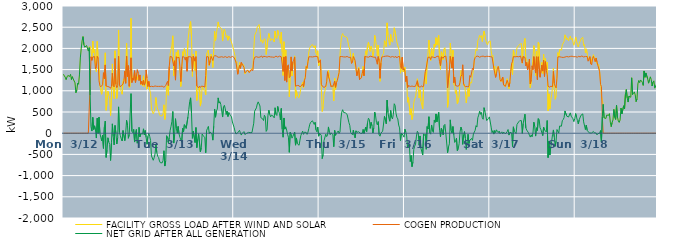
| Category | FACILITY GROSS LOAD AFTER WIND AND SOLAR | COGEN PRODUCTION | NET GRID AFTER ALL GENERATION |
|---|---|---|---|
|  Mon  3/12 | 1390 | 0 | 1390 |
|  Mon  3/12 | 1352 | 0 | 1352 |
|  Mon  3/12 | 1321 | 0 | 1321 |
|  Mon  3/12 | 1262 | 0 | 1262 |
|  Mon  3/12 | 1327 | 0 | 1327 |
|  Mon  3/12 | 1362 | 0 | 1362 |
|  Mon  3/12 | 1377 | 0 | 1377 |
|  Mon  3/12 | 1338 | 0 | 1338 |
|  Mon  3/12 | 1388 | 0 | 1388 |
|  Mon  3/12 | 1266 | 0 | 1266 |
|  Mon  3/12 | 1333 | 0 | 1333 |
|  Mon  3/12 | 1278 | 0 | 1278 |
|  Mon  3/12 | 1258 | 0 | 1258 |
|  Mon  3/12 | 1187 | 0 | 1187 |
|  Mon  3/12 | 955 | 0 | 955 |
|  Mon  3/12 | 1017 | 0 | 1017 |
|  Mon  3/12 | 1180 | 0 | 1180 |
|  Mon  3/12 | 1154 | 0 | 1154 |
|  Mon  3/12 | 1374 | 0 | 1374 |
|  Mon  3/12 | 1775 | 0 | 1775 |
|  Mon  3/12 | 1998 | 0 | 1998 |
|  Mon  3/12 | 2176 | 0 | 2176 |
|  Mon  3/12 | 2278 | 0 | 2278 |
|  Mon  3/12 | 2085 | 0 | 2085 |
|  Mon  3/12 | 2029 | 0 | 2029 |
|  Mon  3/12 | 2047 | 0 | 2047 |
|  Mon  3/12 | 2068 | 0 | 2068 |
|  Mon  3/12 | 2064 | 0 | 2064 |
|  Mon  3/12 | 1937 | 0 | 1937 |
|  Mon  3/12 | 2019 | 0 | 2019 |
|  Mon  3/12 | 2051 | 1151 | 900 |
|  Mon  3/12 | 1959 | 1802 | 157 |
|  Mon  3/12 | 1770 | 1719 | 51 |
|  Mon  3/12 | 2172 | 1799 | 373 |
|  Mon  3/12 | 1894 | 1807 | 87 |
|  Mon  3/12 | 1981 | 1807 | 174 |
|  Mon  3/12 | 1597 | 1518 | 79 |
|  Mon  3/12 | 1450 | 1564 | -114 |
|  Mon  3/12 | 2165 | 1811 | 354 |
|  Mon  3/12 | 1759 | 1765 | -6 |
|  Mon  3/12 | 1614 | 1236 | 378 |
|  Mon  3/12 | 1122 | 1122 | 0 |
|  Mon  3/12 | 998 | 1094 | -96 |
|  Mon  3/12 | 918 | 1098 | -180 |
|  Mon  3/12 | 1092 | 1142 | -50 |
|  Mon  3/12 | 1069 | 1427 | -358 |
|  Mon  3/12 | 1430 | 1286 | 144 |
|  Mon  3/12 | 1896 | 1610 | 286 |
|  Mon  3/12 | 540 | 1111 | -571 |
|  Mon  3/12 | 721 | 1122 | -401 |
|  Mon  3/12 | 993 | 1101 | -108 |
|  Mon  3/12 | 899 | 1108 | -209 |
|  Mon  3/12 | 823 | 1086 | -263 |
|  Mon  3/12 | 416 | 1059 | -643 |
|  Mon  3/12 | 875 | 1102 | -227 |
|  Mon  3/12 | 1634 | 1413 | 221 |
|  Mon  3/12 | 1037 | 1118 | -81 |
|  Mon  3/12 | 815 | 1091 | -276 |
|  Mon  3/12 | 1945 | 1762 | 183 |
|  Mon  3/12 | 1157 | 1157 | 0 |
|  Mon  3/12 | 819 | 1074 | -255 |
|  Mon  3/12 | 1016 | 1119 | -103 |
|  Mon  3/12 | 2435 | 1814 | 621 |
|  Mon  3/12 | 1154 | 1138 | 16 |
|  Mon  3/12 | 1034 | 1090 | -56 |
|  Mon  3/12 | 988 | 1121 | -133 |
|  Mon  3/12 | 919 | 1102 | -183 |
|  Mon  3/12 | 1219 | 1156 | 63 |
|  Mon  3/12 | 1285 | 1237 | 48 |
|  Mon  3/12 | 1289 | 1462 | -173 |
|  Mon  3/12 | 1184 | 1177 | 7 |
|  Mon  3/12 | 2121 | 1817 | 304 |
|  Mon  3/12 | 1526 | 1336 | 190 |
|  Mon  3/12 | 1474 | 1594 | -120 |
|  Mon  3/12 | 1073 | 1106 | -33 |
|  Mon  3/12 | 1105 | 1116 | -11 |
|  Mon  3/12 | 2711 | 1778 | 933 |
|  Mon  3/12 | 1240 | 1194 | 46 |
|  Mon  3/12 | 1313 | 1302 | 11 |
|  Mon  3/12 | 1339 | 1249 | 90 |
|  Mon  3/12 | 1265 | 1474 | -209 |
|  Mon  3/12 | 1213 | 1196 | 17 |
|  Mon  3/12 | 1414 | 1325 | 89 |
|  Mon  3/12 | 1264 | 1499 | -235 |
|  Mon  3/12 | 1252 | 1422 | -170 |
|  Mon  3/12 | 1377 | 1239 | 138 |
|  Mon  3/12 | 1286 | 1374 | -88 |
|  Mon  3/12 | 1146 | 1157 | -11 |
|  Mon  3/12 | 1206 | 1227 | -21 |
|  Mon  3/12 | 1118 | 1139 | -21 |
|  Mon  3/12 | 1353 | 1250 | 103 |
|  Mon  3/12 | 1093 | 1134 | -41 |
|  Mon  3/12 | 1242 | 1179 | 63 |
|  Mon  3/12 | 1392 | 1493 | -101 |
|  Mon  3/12 | 1039 | 1300 | -261 |
|  Mon  3/12 | 1029 | 1101 | -72 |
|  Tue  3/13 | 1218 | 1220 | -2 |
|  Tue  3/13 | 1020 | 1095 | -75 |
|  Tue  3/13 | 935 | 1109 | -174 |
|  Tue  3/13 | 572 | 1107 | -535 |
|  Tue  3/13 | 584 | 1100 | -516 |
|  Tue  3/13 | 458 | 1097 | -639 |
|  Tue  3/13 | 509 | 1089 | -580 |
|  Tue  3/13 | 624 | 1114 | -490 |
|  Tue  3/13 | 842 | 1104 | -262 |
|  Tue  3/13 | 646 | 1104 | -458 |
|  Tue  3/13 | 569 | 1114 | -545 |
|  Tue  3/13 | 531 | 1104 | -573 |
|  Tue  3/13 | 439 | 1095 | -656 |
|  Tue  3/13 | 408 | 1104 | -696 |
|  Tue  3/13 | 414 | 1111 | -697 |
|  Tue  3/13 | 410 | 1110 | -700 |
|  Tue  3/13 | 459 | 1104 | -645 |
|  Tue  3/13 | 670 | 1084 | -414 |
|  Tue  3/13 | 325 | 1100 | -775 |
|  Tue  3/13 | 471 | 1121 | -650 |
|  Tue  3/13 | 1087 | 1144 | -57 |
|  Tue  3/13 | 1134 | 1223 | -89 |
|  Tue  3/13 | 896 | 1123 | -227 |
|  Tue  3/13 | 1471 | 1572 | -101 |
|  Tue  3/13 | 1876 | 1811 | 65 |
|  Tue  3/13 | 1976 | 1812 | 164 |
|  Tue  3/13 | 2076 | 1798 | 278 |
|  Tue  3/13 | 2297 | 1785 | 512 |
|  Tue  3/13 | 1352 | 1585 | -233 |
|  Tue  3/13 | 1663 | 1708 | -45 |
|  Tue  3/13 | 1594 | 1252 | 342 |
|  Tue  3/13 | 1911 | 1803 | 108 |
|  Tue  3/13 | 1774 | 1775 | -1 |
|  Tue  3/13 | 1955 | 1796 | 159 |
|  Tue  3/13 | 1774 | 1790 | -16 |
|  Tue  3/13 | 1467 | 1565 | -98 |
|  Tue  3/13 | 1101 | 1220 | -119 |
|  Tue  3/13 | 1351 | 1562 | -211 |
|  Tue  3/13 | 1922 | 1809 | 113 |
|  Tue  3/13 | 1826 | 1799 | 27 |
|  Tue  3/13 | 1993 | 1790 | 203 |
|  Tue  3/13 | 1902 | 1725 | 177 |
|  Tue  3/13 | 1907 | 1795 | 112 |
|  Tue  3/13 | 1566 | 1461 | 105 |
|  Tue  3/13 | 2183 | 1801 | 382 |
|  Tue  3/13 | 2366 | 1805 | 561 |
|  Tue  3/13 | 2551 | 1804 | 747 |
|  Tue  3/13 | 2633 | 1799 | 834 |
|  Tue  3/13 | 2267 | 1793 | 474 |
|  Tue  3/13 | 1339 | 1461 | -122 |
|  Tue  3/13 | 1866 | 1818 | 48 |
|  Tue  3/13 | 1843 | 1796 | 47 |
|  Tue  3/13 | 1479 | 1699 | -220 |
|  Tue  3/13 | 1940 | 1806 | 134 |
|  Tue  3/13 | 772 | 1114 | -342 |
|  Tue  3/13 | 969 | 1111 | -142 |
|  Tue  3/13 | 1054 | 1068 | -14 |
|  Tue  3/13 | 1106 | 1110 | -4 |
|  Tue  3/13 | 639 | 1080 | -441 |
|  Tue  3/13 | 767 | 1109 | -342 |
|  Tue  3/13 | 1097 | 1116 | -19 |
|  Tue  3/13 | 1048 | 1106 | -58 |
|  Tue  3/13 | 1013 | 1087 | -74 |
|  Tue  3/13 | 989 | 1088 | -99 |
|  Tue  3/13 | 901 | 1362 | -461 |
|  Tue  3/13 | 1869 | 1805 | 64 |
|  Tue  3/13 | 1919 | 1805 | 114 |
|  Tue  3/13 | 1962 | 1801 | 161 |
|  Tue  3/13 | 1597 | 1606 | -9 |
|  Tue  3/13 | 1742 | 1712 | 30 |
|  Tue  3/13 | 1866 | 1814 | 52 |
|  Tue  3/13 | 1791 | 1807 | -16 |
|  Tue  3/13 | 1550 | 1714 | -164 |
|  Tue  3/13 | 1967 | 1801 | 166 |
|  Tue  3/13 | 2402 | 1831 | 571 |
|  Tue  3/13 | 2186 | 1809 | 377 |
|  Tue  3/13 | 2345 | 1819 | 526 |
|  Tue  3/13 | 2367 | 1799 | 568 |
|  Tue  3/13 | 2624 | 1791 | 833 |
|  Tue  3/13 | 2512 | 1802 | 710 |
|  Tue  3/13 | 2535 | 1794 | 741 |
|  Tue  3/13 | 2485 | 1810 | 675 |
|  Tue  3/13 | 2458 | 1804 | 654 |
|  Tue  3/13 | 2173 | 1792 | 381 |
|  Tue  3/13 | 2407 | 1789 | 618 |
|  Tue  3/13 | 2452 | 1794 | 658 |
|  Tue  3/13 | 2381 | 1807 | 574 |
|  Tue  3/13 | 2259 | 1817 | 442 |
|  Tue  3/13 | 2307 | 1784 | 523 |
|  Tue  3/13 | 2190 | 1796 | 394 |
|  Tue  3/13 | 2293 | 1806 | 487 |
|  Tue  3/13 | 2251 | 1806 | 445 |
|  Tue  3/13 | 2201 | 1788 | 413 |
|  Tue  3/13 | 2193 | 1808 | 385 |
|  Tue  3/13 | 2075 | 1811 | 264 |
|  Tue  3/13 | 2069 | 1816 | 253 |
|  Wed  3/14 | 1913 | 1783 | 130 |
|  Wed  3/14 | 1826 | 1784 | 42 |
|  Wed  3/14 | 1658 | 1676 | -18 |
|  Wed  3/14 | 1688 | 1690 | -2 |
|  Wed  3/14 | 1399 | 1390 | 9 |
|  Wed  3/14 | 1502 | 1498 | 4 |
|  Wed  3/14 | 1666 | 1598 | 68 |
|  Wed  3/14 | 1540 | 1529 | 11 |
|  Wed  3/14 | 1627 | 1671 | -44 |
|  Wed  3/14 | 1626 | 1631 | -5 |
|  Wed  3/14 | 1629 | 1615 | 14 |
|  Wed  3/14 | 1590 | 1552 | 38 |
|  Wed  3/14 | 1396 | 1426 | -30 |
|  Wed  3/14 | 1403 | 1433 | -30 |
|  Wed  3/14 | 1454 | 1460 | -6 |
|  Wed  3/14 | 1493 | 1488 | 5 |
|  Wed  3/14 | 1498 | 1479 | 19 |
|  Wed  3/14 | 1436 | 1430 | 6 |
|  Wed  3/14 | 1431 | 1416 | 15 |
|  Wed  3/14 | 1497 | 1497 | 0 |
|  Wed  3/14 | 1530 | 1515 | 15 |
|  Wed  3/14 | 1504 | 1477 | 27 |
|  Wed  3/14 | 1954 | 1718 | 236 |
|  Wed  3/14 | 2310 | 1790 | 520 |
|  Wed  3/14 | 2322 | 1804 | 518 |
|  Wed  3/14 | 2402 | 1804 | 598 |
|  Wed  3/14 | 2503 | 1813 | 690 |
|  Wed  3/14 | 2529 | 1790 | 739 |
|  Wed  3/14 | 2562 | 1806 | 756 |
|  Wed  3/14 | 2438 | 1796 | 642 |
|  Wed  3/14 | 2162 | 1796 | 366 |
|  Wed  3/14 | 2203 | 1821 | 382 |
|  Wed  3/14 | 2122 | 1782 | 340 |
|  Wed  3/14 | 2112 | 1813 | 299 |
|  Wed  3/14 | 2230 | 1806 | 424 |
|  Wed  3/14 | 2193 | 1807 | 386 |
|  Wed  3/14 | 1855 | 1813 | 42 |
|  Wed  3/14 | 1873 | 1794 | 79 |
|  Wed  3/14 | 2224 | 1800 | 424 |
|  Wed  3/14 | 2352 | 1809 | 543 |
|  Wed  3/14 | 2252 | 1810 | 442 |
|  Wed  3/14 | 2184 | 1798 | 386 |
|  Wed  3/14 | 2226 | 1799 | 427 |
|  Wed  3/14 | 2213 | 1796 | 417 |
|  Wed  3/14 | 2209 | 1811 | 398 |
|  Wed  3/14 | 2151 | 1789 | 362 |
|  Wed  3/14 | 2407 | 1807 | 600 |
|  Wed  3/14 | 2262 | 1818 | 444 |
|  Wed  3/14 | 2232 | 1814 | 418 |
|  Wed  3/14 | 2426 | 1795 | 631 |
|  Wed  3/14 | 2326 | 1805 | 521 |
|  Wed  3/14 | 2279 | 1817 | 462 |
|  Wed  3/14 | 2121 | 1806 | 315 |
|  Wed  3/14 | 2385 | 1801 | 584 |
|  Wed  3/14 | 1906 | 1807 | 99 |
|  Wed  3/14 | 1361 | 1456 | -95 |
|  Wed  3/14 | 2158 | 1799 | 359 |
|  Wed  3/14 | 1339 | 1243 | 96 |
|  Wed  3/14 | 1959 | 1810 | 149 |
|  Wed  3/14 | 1279 | 1205 | 74 |
|  Wed  3/14 | 1564 | 1588 | -24 |
|  Wed  3/14 | 1520 | 1614 | -94 |
|  Wed  3/14 | 859 | 1310 | -451 |
|  Wed  3/14 | 1364 | 1341 | 23 |
|  Wed  3/14 | 1785 | 1800 | -15 |
|  Wed  3/14 | 1349 | 1466 | -117 |
|  Wed  3/14 | 1608 | 1683 | -75 |
|  Wed  3/14 | 1644 | 1722 | -78 |
|  Wed  3/14 | 1824 | 1798 | 26 |
|  Wed  3/14 | 827 | 1109 | -282 |
|  Wed  3/14 | 1003 | 1115 | -112 |
|  Wed  3/14 | 878 | 1126 | -248 |
|  Wed  3/14 | 875 | 1114 | -239 |
|  Wed  3/14 | 837 | 1121 | -284 |
|  Wed  3/14 | 930 | 1091 | -161 |
|  Wed  3/14 | 1065 | 1117 | -52 |
|  Wed  3/14 | 1085 | 1122 | -37 |
|  Wed  3/14 | 1204 | 1154 | 50 |
|  Wed  3/14 | 1070 | 1097 | -27 |
|  Wed  3/14 | 1269 | 1245 | 24 |
|  Wed  3/14 | 1354 | 1309 | 45 |
|  Wed  3/14 | 1591 | 1573 | 18 |
|  Wed  3/14 | 1513 | 1540 | -27 |
|  Wed  3/14 | 1712 | 1687 | 25 |
|  Wed  3/14 | 1918 | 1803 | 115 |
|  Wed  3/14 | 2007 | 1797 | 210 |
|  Wed  3/14 | 2058 | 1802 | 256 |
|  Wed  3/14 | 2035 | 1791 | 244 |
|  Wed  3/14 | 2091 | 1798 | 293 |
|  Wed  3/14 | 2068 | 1792 | 276 |
|  Wed  3/14 | 2013 | 1805 | 208 |
|  Wed  3/14 | 2063 | 1806 | 257 |
|  Wed  3/14 | 1894 | 1815 | 79 |
|  Wed  3/14 | 1842 | 1809 | 33 |
|  Wed  3/14 | 1946 | 1801 | 145 |
|  Wed  3/14 | 1588 | 1658 | -70 |
|  Thu  3/15 | 1646 | 1648 | -2 |
|  Thu  3/15 | 1748 | 1730 | 18 |
|  Thu  3/15 | 1105 | 1154 | -49 |
|  Thu  3/15 | 512 | 1111 | -599 |
|  Thu  3/15 | 622 | 1128 | -506 |
|  Thu  3/15 | 902 | 1080 | -178 |
|  Thu  3/15 | 884 | 1069 | -185 |
|  Thu  3/15 | 1083 | 1106 | -23 |
|  Thu  3/15 | 1130 | 1211 | -81 |
|  Thu  3/15 | 1399 | 1451 | -52 |
|  Thu  3/15 | 1481 | 1333 | 148 |
|  Thu  3/15 | 1294 | 1275 | 19 |
|  Thu  3/15 | 1225 | 1260 | -35 |
|  Thu  3/15 | 1103 | 1093 | 10 |
|  Thu  3/15 | 1111 | 1123 | -12 |
|  Thu  3/15 | 1059 | 1096 | -37 |
|  Thu  3/15 | 762 | 1080 | -318 |
|  Thu  3/15 | 1296 | 1230 | 66 |
|  Thu  3/15 | 1030 | 1082 | -52 |
|  Thu  3/15 | 1183 | 1193 | -10 |
|  Thu  3/15 | 1267 | 1246 | 21 |
|  Thu  3/15 | 1382 | 1329 | 53 |
|  Thu  3/15 | 1426 | 1432 | -6 |
|  Thu  3/15 | 1839 | 1809 | 30 |
|  Thu  3/15 | 2145 | 1811 | 334 |
|  Thu  3/15 | 2306 | 1808 | 498 |
|  Thu  3/15 | 2351 | 1797 | 554 |
|  Thu  3/15 | 2290 | 1800 | 490 |
|  Thu  3/15 | 2308 | 1809 | 499 |
|  Thu  3/15 | 2277 | 1797 | 480 |
|  Thu  3/15 | 2279 | 1797 | 482 |
|  Thu  3/15 | 2254 | 1810 | 444 |
|  Thu  3/15 | 2240 | 1798 | 442 |
|  Thu  3/15 | 2039 | 1787 | 252 |
|  Thu  3/15 | 1985 | 1798 | 187 |
|  Thu  3/15 | 1808 | 1791 | 17 |
|  Thu  3/15 | 1652 | 1644 | 8 |
|  Thu  3/15 | 1634 | 1669 | -35 |
|  Thu  3/15 | 1884 | 1809 | 75 |
|  Thu  3/15 | 1723 | 1767 | -44 |
|  Thu  3/15 | 1603 | 1713 | -110 |
|  Thu  3/15 | 1606 | 1549 | 57 |
|  Thu  3/15 | 1374 | 1353 | 21 |
|  Thu  3/15 | 1475 | 1457 | 18 |
|  Thu  3/15 | 1557 | 1523 | 34 |
|  Thu  3/15 | 1281 | 1264 | 17 |
|  Thu  3/15 | 1283 | 1286 | -3 |
|  Thu  3/15 | 1318 | 1306 | 12 |
|  Thu  3/15 | 1408 | 1413 | -5 |
|  Thu  3/15 | 1576 | 1487 | 89 |
|  Thu  3/15 | 1350 | 1356 | -6 |
|  Thu  3/15 | 1798 | 1811 | -13 |
|  Thu  3/15 | 1943 | 1798 | 145 |
|  Thu  3/15 | 1839 | 1801 | 38 |
|  Thu  3/15 | 2069 | 1815 | 254 |
|  Thu  3/15 | 2145 | 1792 | 353 |
|  Thu  3/15 | 2129 | 1806 | 323 |
|  Thu  3/15 | 1931 | 1817 | 114 |
|  Thu  3/15 | 2051 | 1796 | 255 |
|  Thu  3/15 | 1981 | 1805 | 176 |
|  Thu  3/15 | 1803 | 1799 | 4 |
|  Thu  3/15 | 1918 | 1791 | 127 |
|  Thu  3/15 | 2310 | 1812 | 498 |
|  Thu  3/15 | 2208 | 1794 | 414 |
|  Thu  3/15 | 2058 | 1805 | 253 |
|  Thu  3/15 | 1825 | 1628 | 197 |
|  Thu  3/15 | 2080 | 1806 | 274 |
|  Thu  3/15 | 1681 | 1712 | -31 |
|  Thu  3/15 | 1223 | 1294 | -71 |
|  Thu  3/15 | 1653 | 1652 | 1 |
|  Thu  3/15 | 1803 | 1797 | 6 |
|  Thu  3/15 | 1852 | 1803 | 49 |
|  Thu  3/15 | 1877 | 1808 | 69 |
|  Thu  3/15 | 2182 | 1785 | 397 |
|  Thu  3/15 | 2131 | 1815 | 316 |
|  Thu  3/15 | 2039 | 1817 | 222 |
|  Thu  3/15 | 2602 | 1821 | 781 |
|  Thu  3/15 | 2306 | 1818 | 488 |
|  Thu  3/15 | 2167 | 1813 | 354 |
|  Thu  3/15 | 2076 | 1794 | 282 |
|  Thu  3/15 | 2328 | 1793 | 535 |
|  Thu  3/15 | 2177 | 1798 | 379 |
|  Thu  3/15 | 2146 | 1810 | 336 |
|  Thu  3/15 | 2254 | 1807 | 447 |
|  Thu  3/15 | 2487 | 1792 | 695 |
|  Thu  3/15 | 2464 | 1809 | 655 |
|  Thu  3/15 | 2279 | 1809 | 470 |
|  Thu  3/15 | 2150 | 1775 | 375 |
|  Thu  3/15 | 2142 | 1804 | 338 |
|  Thu  3/15 | 1992 | 1800 | 192 |
|  Thu  3/15 | 1936 | 1811 | 125 |
|  Thu  3/15 | 1415 | 1589 | -174 |
|  Thu  3/15 | 1531 | 1528 | 3 |
|  Thu  3/15 | 1776 | 1792 | -16 |
|  Thu  3/15 | 1447 | 1494 | -47 |
|  Thu  3/15 | 1428 | 1522 | -94 |
|  Fri  3/16 | 1559 | 1465 | 94 |
|  Fri  3/16 | 1246 | 1216 | 30 |
|  Fri  3/16 | 1283 | 1348 | -65 |
|  Fri  3/16 | 730 | 1077 | -347 |
|  Fri  3/16 | 847 | 1124 | -277 |
|  Fri  3/16 | 859 | 1112 | -253 |
|  Fri  3/16 | 434 | 1103 | -669 |
|  Fri  3/16 | 580 | 1105 | -525 |
|  Fri  3/16 | 323 | 1112 | -789 |
|  Fri  3/16 | 418 | 1099 | -681 |
|  Fri  3/16 | 719 | 1101 | -382 |
|  Fri  3/16 | 815 | 1121 | -306 |
|  Fri  3/16 | 852 | 1109 | -257 |
|  Fri  3/16 | 1023 | 1090 | -67 |
|  Fri  3/16 | 1283 | 1237 | 46 |
|  Fri  3/16 | 1112 | 1104 | 8 |
|  Fri  3/16 | 829 | 1112 | -283 |
|  Fri  3/16 | 1021 | 1086 | -65 |
|  Fri  3/16 | 755 | 1109 | -354 |
|  Fri  3/16 | 741 | 1117 | -376 |
|  Fri  3/16 | 572 | 1087 | -515 |
|  Fri  3/16 | 1097 | 1113 | -16 |
|  Fri  3/16 | 1075 | 1126 | -51 |
|  Fri  3/16 | 1440 | 1464 | -24 |
|  Fri  3/16 | 1163 | 1542 | -379 |
|  Fri  3/16 | 1698 | 1543 | 155 |
|  Fri  3/16 | 1890 | 1792 | 98 |
|  Fri  3/16 | 2196 | 1808 | 388 |
|  Fri  3/16 | 1799 | 1791 | 8 |
|  Fri  3/16 | 1714 | 1737 | -23 |
|  Fri  3/16 | 1999 | 1805 | 194 |
|  Fri  3/16 | 1859 | 1804 | 55 |
|  Fri  3/16 | 1808 | 1790 | 18 |
|  Fri  3/16 | 2099 | 1794 | 305 |
|  Fri  3/16 | 2037 | 1781 | 256 |
|  Fri  3/16 | 2253 | 1799 | 454 |
|  Fri  3/16 | 2078 | 1812 | 266 |
|  Fri  3/16 | 2056 | 1802 | 254 |
|  Fri  3/16 | 2307 | 1817 | 490 |
|  Fri  3/16 | 1757 | 1686 | 71 |
|  Fri  3/16 | 1504 | 1592 | -88 |
|  Fri  3/16 | 1922 | 1802 | 120 |
|  Fri  3/16 | 1866 | 1815 | 51 |
|  Fri  3/16 | 1728 | 1768 | -40 |
|  Fri  3/16 | 1987 | 1806 | 181 |
|  Fri  3/16 | 2018 | 1810 | 208 |
|  Fri  3/16 | 1820 | 1819 | 1 |
|  Fri  3/16 | 1635 | 1654 | -19 |
|  Fri  3/16 | 610 | 1070 | -460 |
|  Fri  3/16 | 763 | 1089 | -326 |
|  Fri  3/16 | 1238 | 1489 | -251 |
|  Fri  3/16 | 2127 | 1812 | 315 |
|  Fri  3/16 | 1882 | 1818 | 64 |
|  Fri  3/16 | 1538 | 1536 | 2 |
|  Fri  3/16 | 1956 | 1799 | 157 |
|  Fri  3/16 | 1154 | 1192 | -38 |
|  Fri  3/16 | 1101 | 1319 | -218 |
|  Fri  3/16 | 938 | 1126 | -188 |
|  Fri  3/16 | 1007 | 1125 | -118 |
|  Fri  3/16 | 697 | 1108 | -411 |
|  Fri  3/16 | 760 | 1119 | -359 |
|  Fri  3/16 | 875 | 1121 | -246 |
|  Fri  3/16 | 1231 | 1201 | 30 |
|  Fri  3/16 | 1482 | 1337 | 145 |
|  Fri  3/16 | 1454 | 1375 | 79 |
|  Fri  3/16 | 1349 | 1613 | -264 |
|  Fri  3/16 | 1129 | 1165 | -36 |
|  Fri  3/16 | 1158 | 1120 | 38 |
|  Fri  3/16 | 974 | 1094 | -120 |
|  Fri  3/16 | 715 | 1097 | -382 |
|  Fri  3/16 | 903 | 1108 | -205 |
|  Fri  3/16 | 1059 | 1084 | -25 |
|  Fri  3/16 | 869 | 1113 | -244 |
|  Fri  3/16 | 1194 | 1360 | -166 |
|  Fri  3/16 | 1172 | 1319 | -147 |
|  Fri  3/16 | 1185 | 1308 | -123 |
|  Fri  3/16 | 1364 | 1533 | -169 |
|  Fri  3/16 | 1477 | 1497 | -20 |
|  Fri  3/16 | 1701 | 1726 | -25 |
|  Fri  3/16 | 1852 | 1784 | 68 |
|  Fri  3/16 | 1987 | 1809 | 178 |
|  Fri  3/16 | 1947 | 1802 | 145 |
|  Fri  3/16 | 2182 | 1818 | 364 |
|  Fri  3/16 | 2226 | 1800 | 426 |
|  Fri  3/16 | 2309 | 1792 | 517 |
|  Fri  3/16 | 2262 | 1815 | 447 |
|  Fri  3/16 | 2301 | 1811 | 490 |
|  Fri  3/16 | 2161 | 1796 | 365 |
|  Fri  3/16 | 2147 | 1818 | 329 |
|  Fri  3/16 | 2409 | 1807 | 602 |
|  Fri  3/16 | 2312 | 1801 | 511 |
|  Fri  3/16 | 2191 | 1787 | 404 |
|  Fri  3/16 | 2112 | 1814 | 298 |
|  Fri  3/16 | 2085 | 1806 | 279 |
|  Fri  3/16 | 2157 | 1811 | 346 |
|  Fri  3/16 | 2175 | 1790 | 385 |
|  Sat  3/17 | 2177 | 1807 | 370 |
|  Sat  3/17 | 1949 | 1806 | 143 |
|  Sat  3/17 | 1809 | 1797 | 12 |
|  Sat  3/17 | 1837 | 1776 | 61 |
|  Sat  3/17 | 1510 | 1531 | -21 |
|  Sat  3/17 | 1585 | 1521 | 64 |
|  Sat  3/17 | 1329 | 1316 | 13 |
|  Sat  3/17 | 1490 | 1410 | 80 |
|  Sat  3/17 | 1558 | 1519 | 39 |
|  Sat  3/17 | 1586 | 1573 | 13 |
|  Sat  3/17 | 1497 | 1446 | 51 |
|  Sat  3/17 | 1255 | 1266 | -11 |
|  Sat  3/17 | 1214 | 1224 | -10 |
|  Sat  3/17 | 1241 | 1209 | 32 |
|  Sat  3/17 | 1309 | 1325 | -16 |
|  Sat  3/17 | 1162 | 1135 | 27 |
|  Sat  3/17 | 1159 | 1144 | 15 |
|  Sat  3/17 | 1089 | 1106 | -17 |
|  Sat  3/17 | 1105 | 1110 | -5 |
|  Sat  3/17 | 1285 | 1248 | 37 |
|  Sat  3/17 | 1272 | 1185 | 87 |
|  Sat  3/17 | 1051 | 1095 | -44 |
|  Sat  3/17 | 1212 | 1193 | 19 |
|  Sat  3/17 | 1464 | 1452 | 12 |
|  Sat  3/17 | 1648 | 1639 | 9 |
|  Sat  3/17 | 1382 | 1697 | -315 |
|  Sat  3/17 | 1957 | 1807 | 150 |
|  Sat  3/17 | 1847 | 1803 | 44 |
|  Sat  3/17 | 1847 | 1801 | 46 |
|  Sat  3/17 | 1802 | 1811 | -9 |
|  Sat  3/17 | 2012 | 1808 | 204 |
|  Sat  3/17 | 2027 | 1804 | 223 |
|  Sat  3/17 | 2072 | 1802 | 270 |
|  Sat  3/17 | 2097 | 1803 | 294 |
|  Sat  3/17 | 2093 | 1821 | 272 |
|  Sat  3/17 | 2114 | 1817 | 297 |
|  Sat  3/17 | 1650 | 1655 | -5 |
|  Sat  3/17 | 2038 | 1809 | 229 |
|  Sat  3/17 | 2051 | 1801 | 250 |
|  Sat  3/17 | 2235 | 1788 | 447 |
|  Sat  3/17 | 1713 | 1589 | 124 |
|  Sat  3/17 | 1740 | 1667 | 73 |
|  Sat  3/17 | 1581 | 1491 | 90 |
|  Sat  3/17 | 1597 | 1587 | 10 |
|  Sat  3/17 | 1701 | 1749 | -48 |
|  Sat  3/17 | 1073 | 1165 | -92 |
|  Sat  3/17 | 1218 | 1256 | -38 |
|  Sat  3/17 | 1502 | 1589 | -87 |
|  Sat  3/17 | 1503 | 1498 | 5 |
|  Sat  3/17 | 2065 | 1806 | 259 |
|  Sat  3/17 | 1961 | 1802 | 159 |
|  Sat  3/17 | 1351 | 1419 | -68 |
|  Sat  3/17 | 1931 | 1803 | 128 |
|  Sat  3/17 | 1329 | 1265 | 64 |
|  Sat  3/17 | 2147 | 1802 | 345 |
|  Sat  3/17 | 2113 | 1796 | 317 |
|  Sat  3/17 | 1447 | 1320 | 127 |
|  Sat  3/17 | 1421 | 1338 | 83 |
|  Sat  3/17 | 1670 | 1605 | 65 |
|  Sat  3/17 | 1408 | 1465 | -57 |
|  Sat  3/17 | 1862 | 1720 | 142 |
|  Sat  3/17 | 1415 | 1337 | 78 |
|  Sat  3/17 | 1771 | 1687 | 84 |
|  Sat  3/17 | 1516 | 1487 | 29 |
|  Sat  3/17 | 1676 | 1377 | 299 |
|  Sat  3/17 | 531 | 1107 | -576 |
|  Sat  3/17 | 929 | 1117 | -188 |
|  Sat  3/17 | 570 | 1084 | -514 |
|  Sat  3/17 | 774 | 1109 | -335 |
|  Sat  3/17 | 913 | 1109 | -196 |
|  Sat  3/17 | 1062 | 1097 | -35 |
|  Sat  3/17 | 1535 | 1458 | 77 |
|  Sat  3/17 | 1087 | 1174 | -87 |
|  Sat  3/17 | 800 | 1111 | -311 |
|  Sat  3/17 | 883 | 1069 | -186 |
|  Sat  3/17 | 1386 | 1299 | 87 |
|  Sat  3/17 | 1899 | 1799 | 100 |
|  Sat  3/17 | 1799 | 1799 | 0 |
|  Sat  3/17 | 1972 | 1802 | 170 |
|  Sat  3/17 | 1953 | 1802 | 151 |
|  Sat  3/17 | 1958 | 1793 | 165 |
|  Sat  3/17 | 2087 | 1793 | 294 |
|  Sat  3/17 | 2107 | 1786 | 321 |
|  Sat  3/17 | 2165 | 1798 | 367 |
|  Sat  3/17 | 2320 | 1795 | 525 |
|  Sat  3/17 | 2340 | 1793 | 547 |
|  Sat  3/17 | 2212 | 1809 | 403 |
|  Sat  3/17 | 2236 | 1812 | 424 |
|  Sat  3/17 | 2180 | 1799 | 381 |
|  Sat  3/17 | 2189 | 1794 | 395 |
|  Sat  3/17 | 2290 | 1811 | 479 |
|  Sat  3/17 | 2207 | 1806 | 401 |
|  Sat  3/17 | 2239 | 1816 | 423 |
|  Sat  3/17 | 2149 | 1808 | 341 |
|  Sat  3/17 | 2074 | 1802 | 272 |
|  Sat  3/17 | 2150 | 1810 | 340 |
|  Sun  3/18 | 2270 | 1807 | 463 |
|  Sun  3/18 | 2177 | 1797 | 380 |
|  Sun  3/18 | 2091 | 1790 | 301 |
|  Sun  3/18 | 2033 | 1814 | 219 |
|  Sun  3/18 | 2113 | 1796 | 317 |
|  Sun  3/18 | 2110 | 1801 | 309 |
|  Sun  3/18 | 2222 | 1799 | 423 |
|  Sun  3/18 | 2225 | 1821 | 404 |
|  Sun  3/18 | 2261 | 1806 | 455 |
|  Sun  3/18 | 2065 | 1798 | 267 |
|  Sun  3/18 | 2089 | 1810 | 279 |
|  Sun  3/18 | 1895 | 1809 | 86 |
|  Sun  3/18 | 1989 | 1799 | 190 |
|  Sun  3/18 | 1876 | 1809 | 67 |
|  Sun  3/18 | 1733 | 1698 | 35 |
|  Sun  3/18 | 1737 | 1712 | 25 |
|  Sun  3/18 | 1808 | 1805 | 3 |
|  Sun  3/18 | 1635 | 1637 | -2 |
|  Sun  3/18 | 1617 | 1612 | 5 |
|  Sun  3/18 | 1790 | 1762 | 28 |
|  Sun  3/18 | 1853 | 1812 | 41 |
|  Sun  3/18 | 1798 | 1790 | 8 |
|  Sun  3/18 | 1687 | 1686 | 1 |
|  Sun  3/18 | 1777 | 1773 | 4 |
|  Sun  3/18 | 1644 | 1683 | -39 |
|  Sun  3/18 | 1591 | 1601 | -10 |
|  Sun  3/18 | 1624 | 1616 | 8 |
|  Sun  3/18 | 1445 | 1448 | -3 |
|  Sun  3/18 | 1212 | 1150 | 62 |
|  Sun  3/18 | 887 | 1100 | -213 |
|  Sun  3/18 | 778 | 390 | 388 |
|  Sun  3/18 | 680 | 0 | 680 |
|  Sun  3/18 | 362 | 0 | 362 |
|  Sun  3/18 | 353 | 0 | 353 |
|  Sun  3/18 | 347 | 0 | 347 |
|  Sun  3/18 | 429 | 0 | 429 |
|  Sun  3/18 | 431 | 0 | 431 |
|  Sun  3/18 | 420 | 0 | 420 |
|  Sun  3/18 | 461 | 0 | 461 |
|  Sun  3/18 | 261 | 0 | 261 |
|  Sun  3/18 | 155 | 0 | 155 |
|  Sun  3/18 | 253 | 0 | 253 |
|  Sun  3/18 | 312 | 0 | 312 |
|  Sun  3/18 | 561 | 0 | 561 |
|  Sun  3/18 | 369 | 0 | 369 |
|  Sun  3/18 | 323 | 0 | 323 |
|  Sun  3/18 | 658 | 0 | 658 |
|  Sun  3/18 | 382 | 0 | 382 |
|  Sun  3/18 | 289 | 0 | 289 |
|  Sun  3/18 | 255 | 0 | 255 |
|  Sun  3/18 | 314 | 0 | 314 |
|  Sun  3/18 | 592 | 0 | 592 |
|  Sun  3/18 | 453 | 0 | 453 |
|  Sun  3/18 | 461 | 0 | 461 |
|  Sun  3/18 | 647 | 0 | 647 |
|  Sun  3/18 | 575 | 0 | 575 |
|  Sun  3/18 | 920 | 0 | 920 |
|  Sun  3/18 | 1030 | 0 | 1030 |
|  Sun  3/18 | 831 | 0 | 831 |
|  Sun  3/18 | 735 | 0 | 735 |
|  Sun  3/18 | 875 | 0 | 875 |
|  Sun  3/18 | 898 | 0 | 898 |
|  Sun  3/18 | 848 | 0 | 848 |
|  Sun  3/18 | 1307 | 0 | 1307 |
|  Sun  3/18 | 910 | 0 | 910 |
|  Sun  3/18 | 935 | 0 | 935 |
|  Sun  3/18 | 974 | 0 | 974 |
|  Sun  3/18 | 905 | 0 | 905 |
|  Sun  3/18 | 745 | 0 | 745 |
|  Sun  3/18 | 807 | 0 | 807 |
|  Sun  3/18 | 1163 | 0 | 1163 |
|  Sun  3/18 | 1244 | 0 | 1244 |
|  Sun  3/18 | 1192 | 0 | 1192 |
|  Sun  3/18 | 1256 | 0 | 1256 |
|  Sun  3/18 | 1230 | 0 | 1230 |
|  Sun  3/18 | 1200 | 0 | 1200 |
|  Sun  3/18 | 1128 | 0 | 1128 |
|  Sun  3/18 | 1468 | 0 | 1468 |
|  Sun  3/18 | 1319 | 0 | 1319 |
|  Sun  3/18 | 1421 | 0 | 1421 |
|  Sun  3/18 | 1415 | 0 | 1415 |
|  Sun  3/18 | 1283 | 0 | 1283 |
|  Sun  3/18 | 1180 | 0 | 1180 |
|  Sun  3/18 | 1257 | 0 | 1257 |
|  Sun  3/18 | 1330 | 0 | 1330 |
|  Sun  3/18 | 1265 | 0 | 1265 |
|  Sun  3/18 | 1113 | 0 | 1113 |
|  Sun  3/18 | 1204 | 0 | 1204 |
|  Sun  3/18 | 1235 | 0 | 1235 |
|  Sun  3/18 | 1062 | 0 | 1062 |
|  Sun  3/18 | 1055 | 0 | 1055 |
|  Sun  3/18 | 1159 | 0 | 1159 |